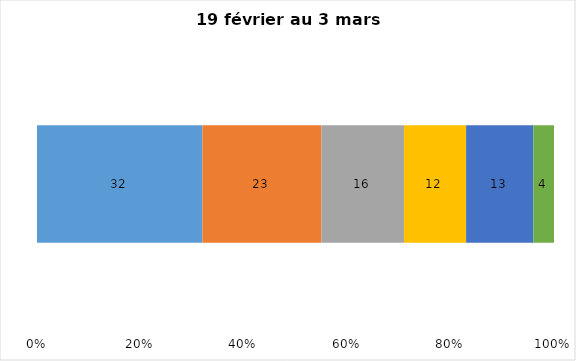
| Category | Plusieurs fois par jour | Une fois par jour | Quelques fois par semaine   | Une fois par semaine ou moins   |  Jamais   |  Je n’utilise pas les médias sociaux |
|---|---|---|---|---|---|---|
| 0 | 32 | 23 | 16 | 12 | 13 | 4 |